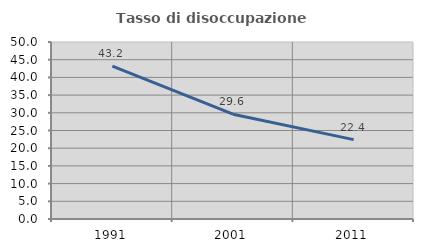
| Category | Tasso di disoccupazione giovanile  |
|---|---|
| 1991.0 | 43.2 |
| 2001.0 | 29.6 |
| 2011.0 | 22.414 |